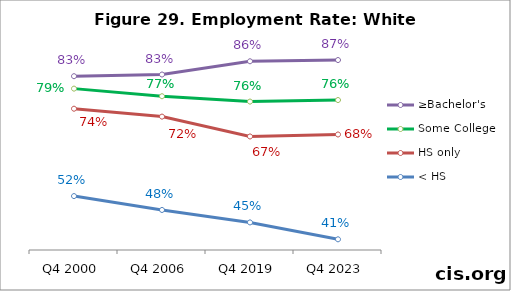
| Category | ≥Bachelor's | Some College | HS only | < HS |
|---|---|---|---|---|
| Q4 2000 | 0.825 | 0.793 | 0.742 | 0.518 |
| Q4 2006 | 0.83 | 0.774 | 0.722 | 0.483 |
| Q4 2019 | 0.864 | 0.76 | 0.671 | 0.451 |
| Q4 2023 | 0.867 | 0.764 | 0.676 | 0.407 |